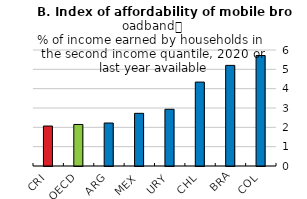
| Category | Series 0 |
|---|---|
| CRI | 2.067 |
| OECD | 2.149 |
| ARG | 2.223 |
| MEX | 2.724 |
| URY | 2.933 |
| CHL | 4.34 |
| BRA | 5.205 |
| COL | 5.714 |